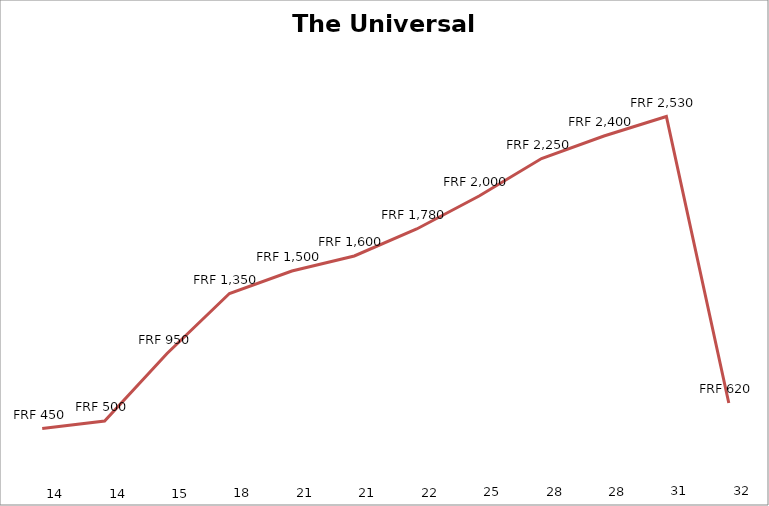
| Category | Sc | Universal Bank |
|---|---|---|
| 0 | 14 | 450 |
| 1 | 14 | 500 |
| 2 | 15 | 950 |
| 3 | 18 | 1350 |
| 4 | 21 | 1500 |
| 5 | 21 | 1600 |
| 6 | 22 | 1780 |
| 7 | 25 | 2000 |
| 8 | 28 | 2250 |
| 9 | 28 | 2400 |
| 10 | 31 | 2530 |
| 11 | 32 | 620 |